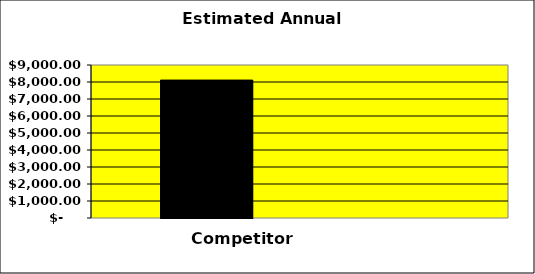
| Category | Series 0 | Series 1 | Series 2 |
|---|---|---|---|
| 0 | 8112.5 |  | 0 |